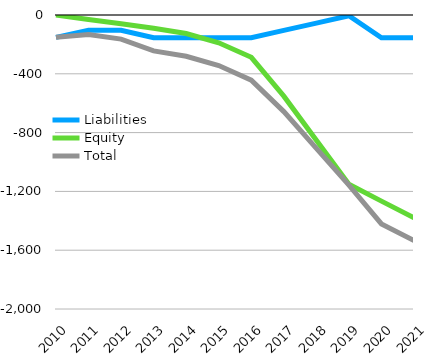
| Category | Liabilities  | Equity  | Total  |
|---|---|---|---|
| 2010 | -152 | 0 | -152 |
| 2011 | -103 | -30 | -133 |
| 2012 | -104 | -60 | -164 |
| 2013 | -154 | -90 | -244 |
| 2014 | -155 | -126 | -281 |
| 2015 | -155 | -189 | -344 |
| 2016 | -155 | -288 | -443 |
| 2017 | -105 | -552 | -657 |
| 2018 | -55 | -852 | -907 |
| 2019 | -5 | -1152 | -1157 |
| 2020 | -155 | -1266 | -1421 |
| 2021 | -155 | -1380 | -1535 |